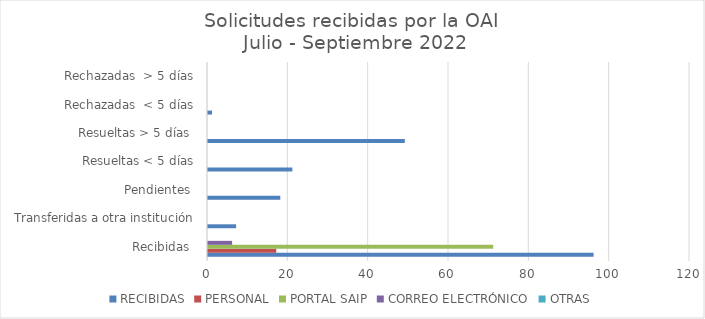
| Category | RECIBIDAS | PERSONAL | PORTAL SAIP | CORREO ELECTRÓNICO | OTRAS |
|---|---|---|---|---|---|
| Recibidas  | 96 | 17 | 71 | 6 | 0 |
|  Transferidas a otra institución | 7 | 0 | 0 | 0 | 0 |
| Pendientes  | 18 | 0 | 0 | 0 | 0 |
| Resueltas < 5 días | 21 | 0 | 0 | 0 | 0 |
| Resueltas > 5 días  | 49 | 0 | 0 | 0 | 0 |
| Rechazadas  < 5 días | 1 | 0 | 0 | 0 | 0 |
| Rechazadas  > 5 días | 0 | 0 | 0 | 0 | 0 |